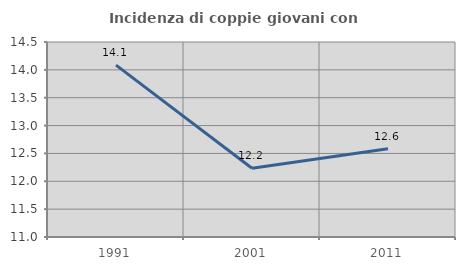
| Category | Incidenza di coppie giovani con figli |
|---|---|
| 1991.0 | 14.085 |
| 2001.0 | 12.234 |
| 2011.0 | 12.585 |